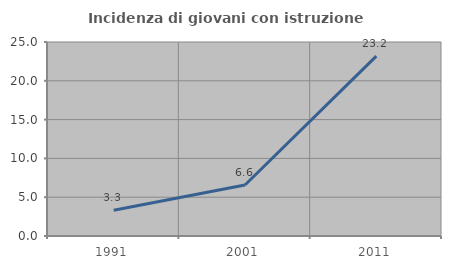
| Category | Incidenza di giovani con istruzione universitaria |
|---|---|
| 1991.0 | 3.306 |
| 2001.0 | 6.569 |
| 2011.0 | 23.179 |